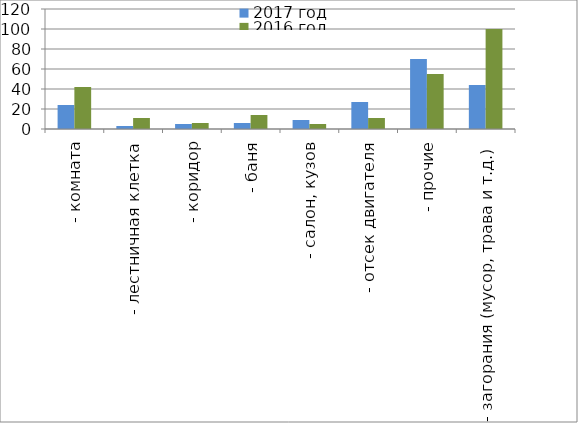
| Category | 2017 год | 2016 год |
|---|---|---|
|  - комната | 24 | 42 |
|  - лестничная клетка | 3 | 11 |
|  - коридор | 5 | 6 |
|  - баня | 6 | 14 |
|  - салон, кузов | 9 | 5 |
|  - отсек двигателя | 27 | 11 |
| - прочие | 70 | 55 |
| - загорания (мусор, трава и т.д.)  | 44 | 100 |